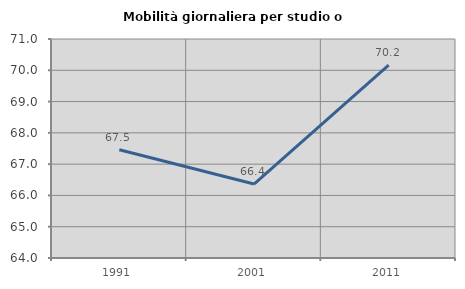
| Category | Mobilità giornaliera per studio o lavoro |
|---|---|
| 1991.0 | 67.463 |
| 2001.0 | 66.364 |
| 2011.0 | 70.162 |